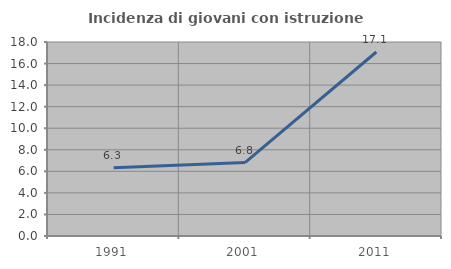
| Category | Incidenza di giovani con istruzione universitaria |
|---|---|
| 1991.0 | 6.332 |
| 2001.0 | 6.809 |
| 2011.0 | 17.073 |